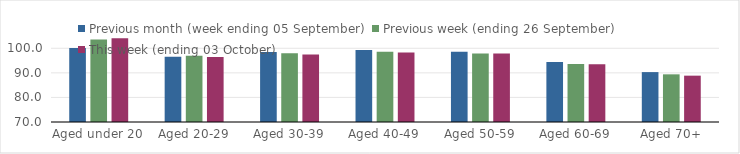
| Category | Previous month (week ending 05 September) | Previous week (ending 26 September) | This week (ending 03 October) |
|---|---|---|---|
| Aged under 20 | 100.13 | 103.55 | 104.07 |
| Aged 20-29 | 96.56 | 96.96 | 96.45 |
| Aged 30-39 | 98.49 | 98 | 97.5 |
| Aged 40-49 | 99.28 | 98.6 | 98.28 |
| Aged 50-59 | 98.56 | 97.86 | 97.86 |
| Aged 60-69 | 94.45 | 93.59 | 93.46 |
| Aged 70+ | 90.31 | 89.4 | 88.86 |